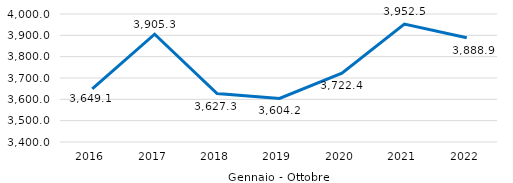
| Category | Series 0 |
|---|---|
| 0 | 3649.127 |
| 1 | 3905.311 |
| 2 | 3627.335 |
| 3 | 3604.161 |
| 4 | 3722.382 |
| 5 | 3952.499 |
| 6 | 3888.856 |